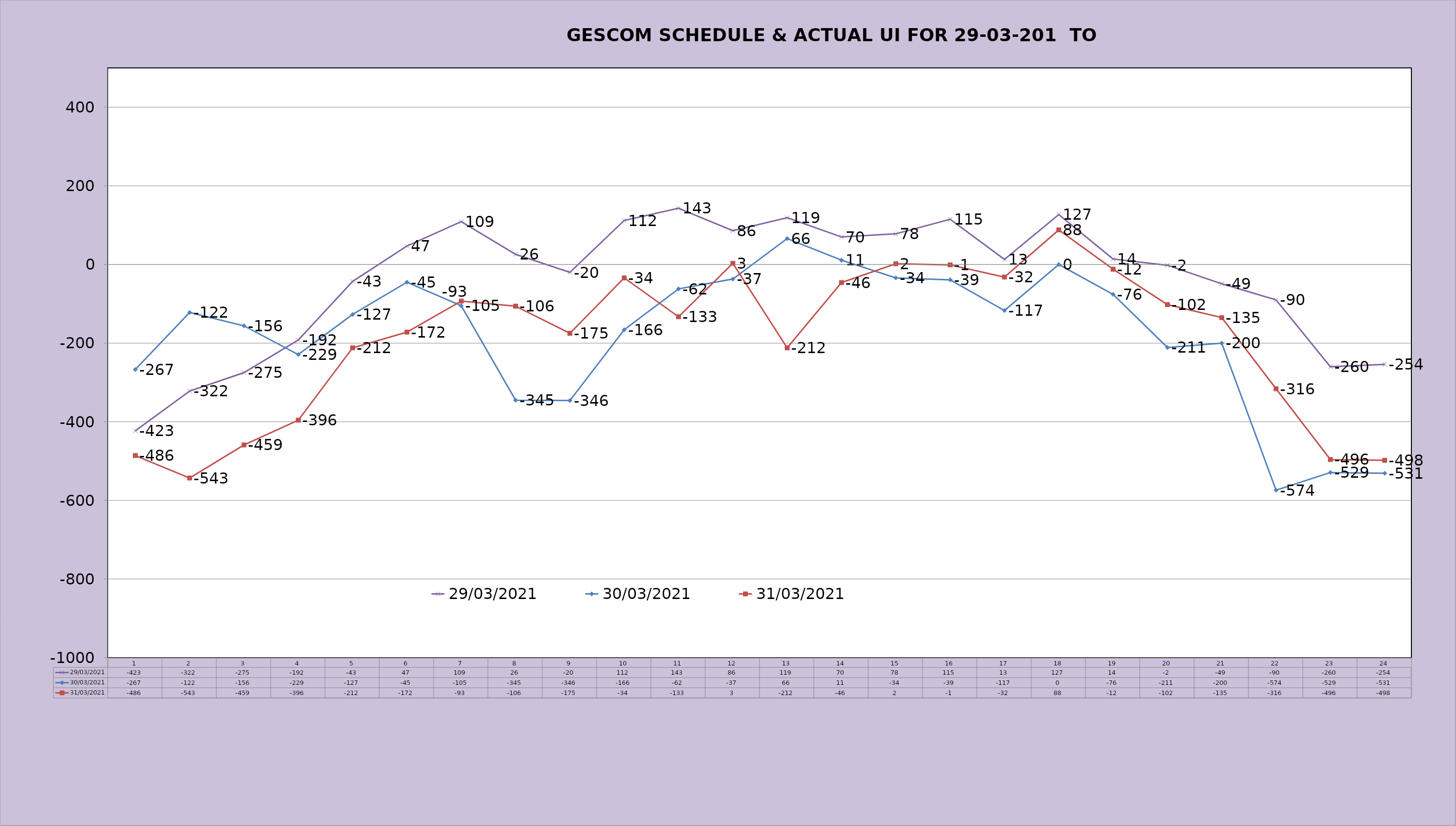
| Category | 29/03/2021 | 30/03/2021 | 31/03/2021 |
|---|---|---|---|
| 0 | -423 | -267 | -486 |
| 1 | -322 | -122 | -543 |
| 2 | -275 | -156 | -459 |
| 3 | -192 | -229 | -396 |
| 4 | -43 | -127 | -212 |
| 5 | 47 | -45 | -172 |
| 6 | 109 | -105 | -93 |
| 7 | 26 | -345 | -106 |
| 8 | -20 | -346 | -175 |
| 9 | 112 | -166 | -34 |
| 10 | 143 | -62 | -133 |
| 11 | 86 | -37 | 3 |
| 12 | 119 | 66 | -212 |
| 13 | 70 | 11 | -46 |
| 14 | 78 | -34 | 2 |
| 15 | 115 | -39 | -1 |
| 16 | 13 | -117 | -32 |
| 17 | 127 | 0 | 88 |
| 18 | 14 | -76 | -12 |
| 19 | -2 | -211 | -102 |
| 20 | -49 | -200 | -135 |
| 21 | -90 | -574 | -316 |
| 22 | -260 | -529 | -496 |
| 23 | -254 | -531 | -498 |